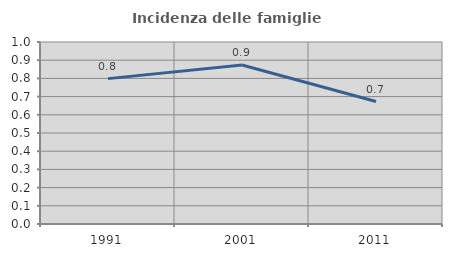
| Category | Incidenza delle famiglie numerose |
|---|---|
| 1991.0 | 0.799 |
| 2001.0 | 0.873 |
| 2011.0 | 0.673 |